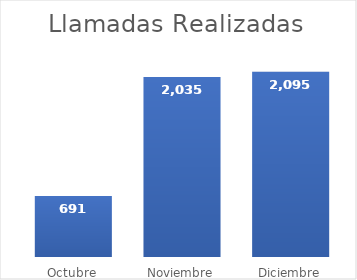
| Category | Llamadas Realizadas |
|---|---|
| Octubre | 691 |
| Noviembre | 2035 |
| Diciembre | 2095 |